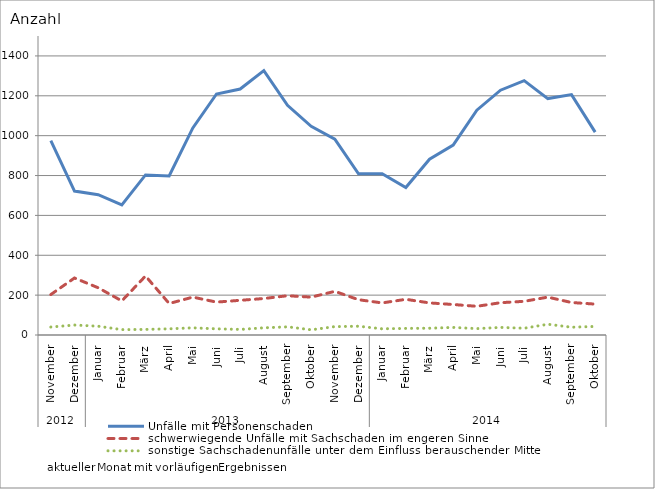
| Category | Unfälle mit Personenschaden | schwerwiegende Unfälle mit Sachschaden im engeren Sinne | sonstige Sachschadenunfälle unter dem Einfluss berauschender Mittel |
|---|---|---|---|
| 0 | 975 | 203 | 40 |
| 1 | 722 | 286 | 50 |
| 2 | 704 | 237 | 44 |
| 3 | 653 | 171 | 27 |
| 4 | 803 | 296 | 28 |
| 5 | 798 | 158 | 31 |
| 6 | 1039 | 190 | 36 |
| 7 | 1209 | 165 | 31 |
| 8 | 1234 | 174 | 28 |
| 9 | 1326 | 183 | 36 |
| 10 | 1152 | 197 | 41 |
| 11 | 1047 | 190 | 26 |
| 12 | 983 | 219 | 42 |
| 13 | 809 | 177 | 44 |
| 14 | 809 | 161 | 31 |
| 15 | 740 | 179 | 33 |
| 16 | 882 | 161 | 34 |
| 17 | 953 | 153 | 38 |
| 18 | 1128 | 144 | 32 |
| 19 | 1228 | 162 | 38 |
| 20 | 1276 | 169 | 34 |
| 21 | 1186 | 190 | 54 |
| 22 | 1206 | 163 | 39 |
| 23 | 1018 | 155 | 43 |